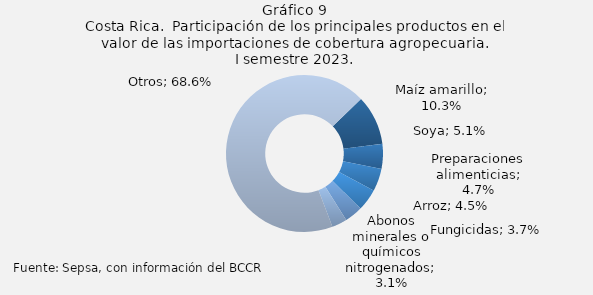
| Category | Series 0 |
|---|---|
| Maíz amarillo | 186726.069 |
| Soya | 93018.837 |
| Preparaciones alimenticias | 84946.17 |
| Arroz | 82331.654 |
| Fungicidas | 68067.942 |
| Abonos minerales o químicos nitrogenados | 56790.772 |
| Otros | 1247598.277 |